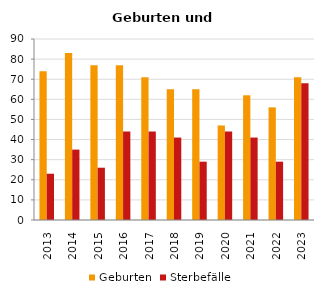
| Category | Geburten | Sterbefälle |
|---|---|---|
| 2013.0 | 74 | 23 |
| 2014.0 | 83 | 35 |
| 2015.0 | 77 | 26 |
| 2016.0 | 77 | 44 |
| 2017.0 | 71 | 44 |
| 2018.0 | 65 | 41 |
| 2019.0 | 65 | 29 |
| 2020.0 | 47 | 44 |
| 2021.0 | 62 | 41 |
| 2022.0 | 56 | 29 |
| 2023.0 | 71 | 68 |